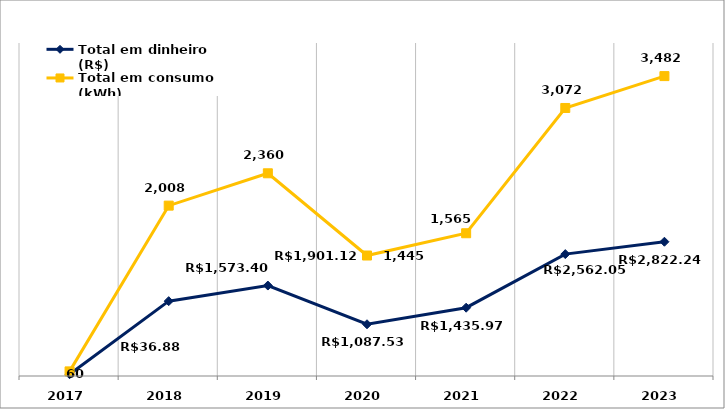
| Category | Total em dinheiro (R$) | Total em consumo (kWh) |
|---|---|---|
| 2017.0 | 36.88 | 60 |
| 2018.0 | 1573.4 | 2008 |
| 2019.0 | 1901.12 | 2360 |
| 2020.0 | 1087.53 | 1445 |
| 2021.0 | 1435.97 | 1565 |
| 2022.0 | 2562.05 | 3072 |
| 2023.0 | 2822.24 | 3482 |